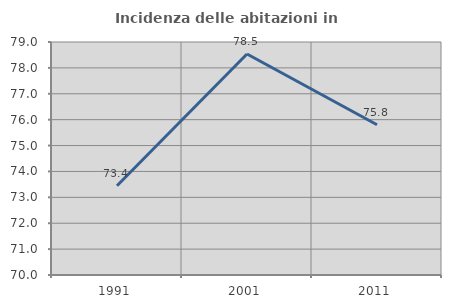
| Category | Incidenza delle abitazioni in proprietà  |
|---|---|
| 1991.0 | 73.447 |
| 2001.0 | 78.535 |
| 2011.0 | 75.803 |